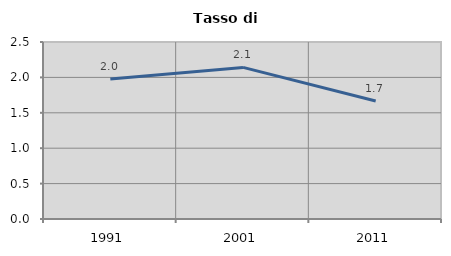
| Category | Tasso di disoccupazione   |
|---|---|
| 1991.0 | 1.977 |
| 2001.0 | 2.141 |
| 2011.0 | 1.667 |